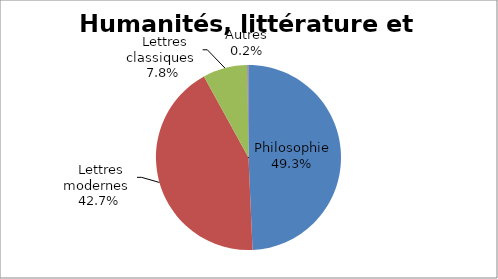
| Category | Humanités, littérature et philosophie |
|---|---|
| Philosophie | 0.493 |
| Lettres modernes | 0.427 |
| Lettres classiques | 0.078 |
| Autres | 0.002 |